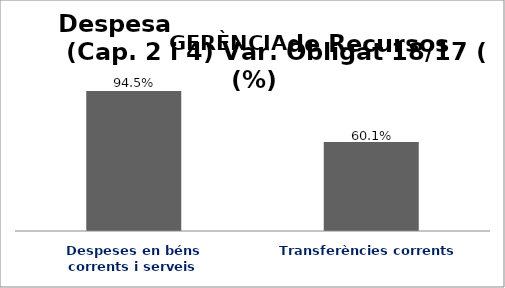
| Category | Series 0 |
|---|---|
| Despeses en béns corrents i serveis | 0.945 |
| Transferències corrents | 0.601 |